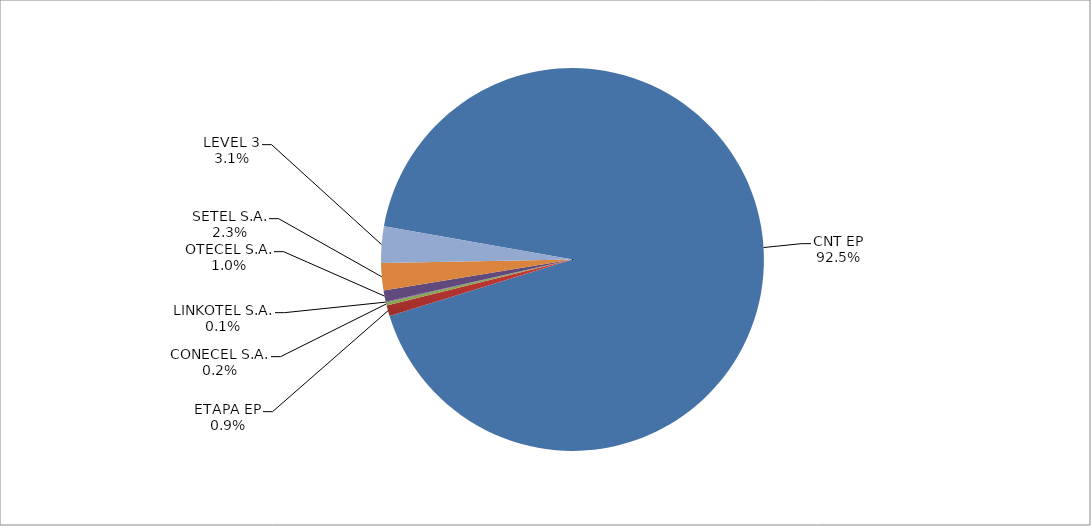
| Category | Series 0 |
|---|---|
| CNT EP | 2621 |
| ETAPA EP | 26 |
| CONECEL S.A. | 7 |
| LINKOTEL S.A. | 2 |
| OTECEL S.A. | 27 |
| SETEL S.A. | 65 |
| LEVEL 3 | 87 |